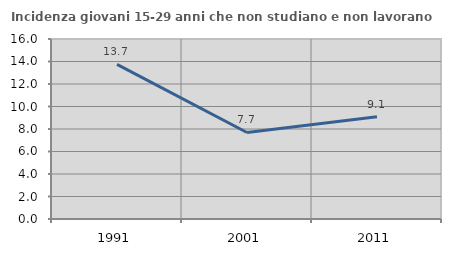
| Category | Incidenza giovani 15-29 anni che non studiano e non lavorano  |
|---|---|
| 1991.0 | 13.748 |
| 2001.0 | 7.692 |
| 2011.0 | 9.091 |